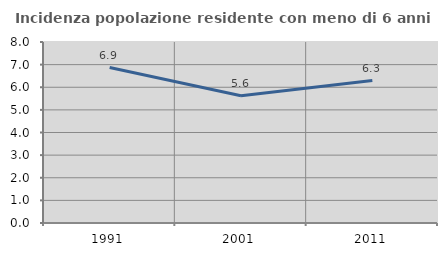
| Category | Incidenza popolazione residente con meno di 6 anni |
|---|---|
| 1991.0 | 6.871 |
| 2001.0 | 5.627 |
| 2011.0 | 6.296 |